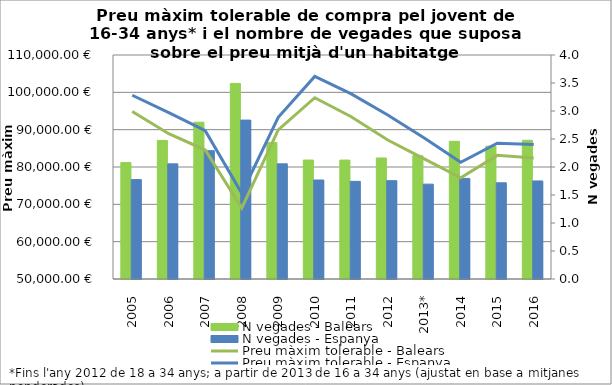
| Category | N vegades - Balears | N vegades - Espanya |
|---|---|---|
| 2005 | 2.078 | 1.775 |
| 2006 | 2.474 | 2.056 |
| 2007 | 2.8 | 2.292 |
| 2008 | 3.492 | 2.838 |
| 2009 | 2.438 | 2.056 |
| 2010 | 2.124 | 1.768 |
| 2011 | 2.124 | 1.744 |
| 2012 | 2.162 | 1.756 |
| 2013* | 2.203 | 1.694 |
| 2014 | 2.458 | 1.796 |
| 2015 | 2.372 | 1.718 |
| 2016 | 2.478 | 1.751 |